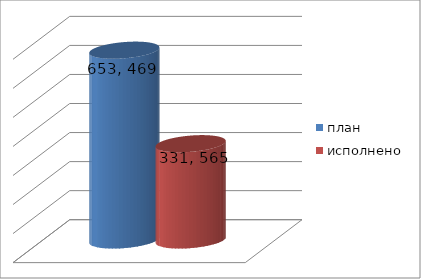
| Category | план | исполнено |
|---|---|---|
| 0 | 653469739.63 | 331565210.59 |